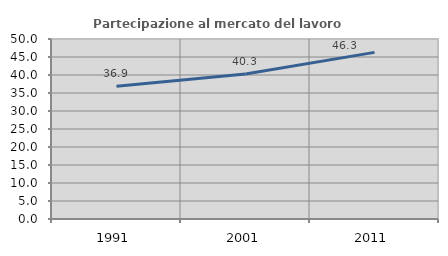
| Category | Partecipazione al mercato del lavoro  femminile |
|---|---|
| 1991.0 | 36.89 |
| 2001.0 | 40.293 |
| 2011.0 | 46.286 |